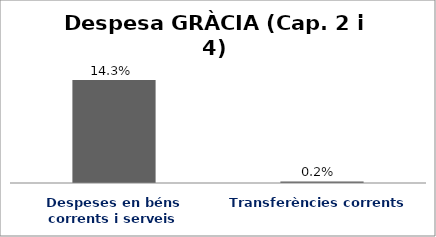
| Category | Series 0 |
|---|---|
| Despeses en béns corrents i serveis | 0.143 |
| Transferències corrents | 0.002 |